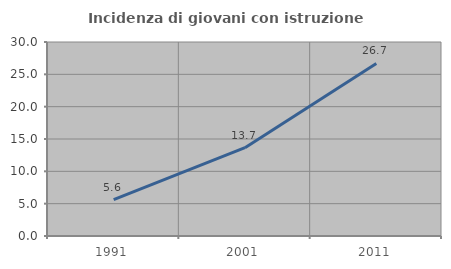
| Category | Incidenza di giovani con istruzione universitaria |
|---|---|
| 1991.0 | 5.614 |
| 2001.0 | 13.663 |
| 2011.0 | 26.688 |